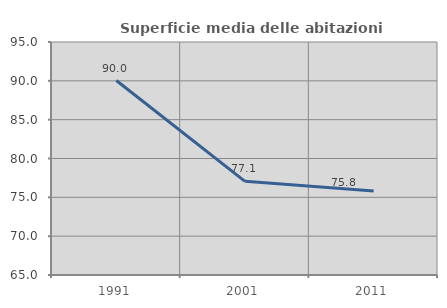
| Category | Superficie media delle abitazioni occupate |
|---|---|
| 1991.0 | 90.038 |
| 2001.0 | 77.061 |
| 2011.0 | 75.826 |